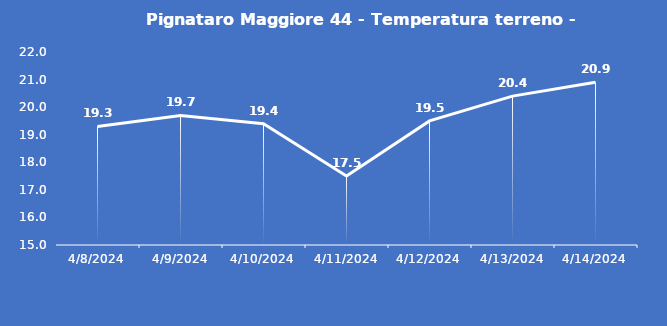
| Category | Pignataro Maggiore 44 - Temperatura terreno - Grezzo (°C) |
|---|---|
| 4/8/24 | 19.3 |
| 4/9/24 | 19.7 |
| 4/10/24 | 19.4 |
| 4/11/24 | 17.5 |
| 4/12/24 | 19.5 |
| 4/13/24 | 20.4 |
| 4/14/24 | 20.9 |